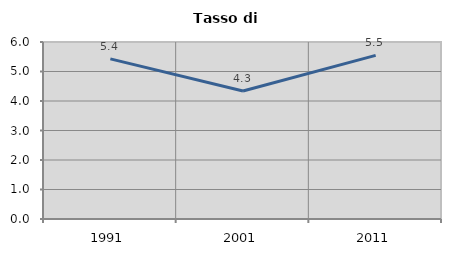
| Category | Tasso di disoccupazione   |
|---|---|
| 1991.0 | 5.429 |
| 2001.0 | 4.341 |
| 2011.0 | 5.548 |